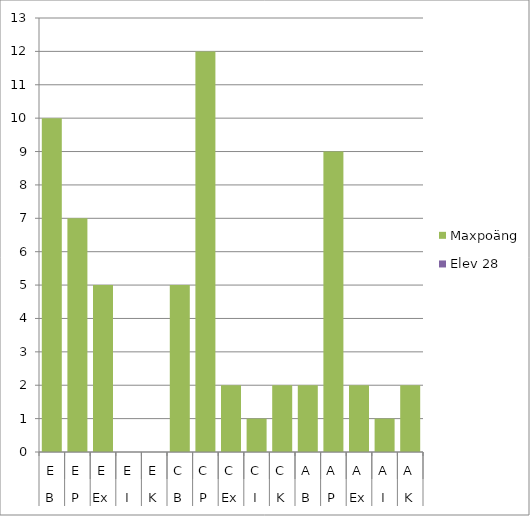
| Category | Maxpoäng | Elev 28 |
|---|---|---|
| 0 | 10 | 0 |
| 1 | 7 | 0 |
| 2 | 5 | 0 |
| 3 | 0 | 0 |
| 4 | 0 | 0 |
| 5 | 5 | 0 |
| 6 | 12 | 0 |
| 7 | 2 | 0 |
| 8 | 1 | 0 |
| 9 | 2 | 0 |
| 10 | 2 | 0 |
| 11 | 9 | 0 |
| 12 | 2 | 0 |
| 13 | 1 | 0 |
| 14 | 2 | 0 |